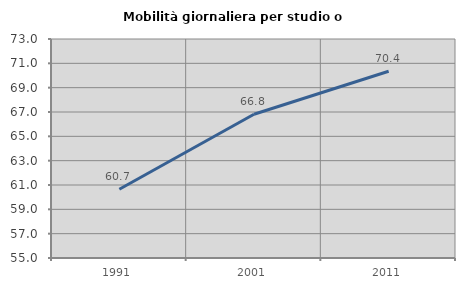
| Category | Mobilità giornaliera per studio o lavoro |
|---|---|
| 1991.0 | 60.652 |
| 2001.0 | 66.819 |
| 2011.0 | 70.353 |